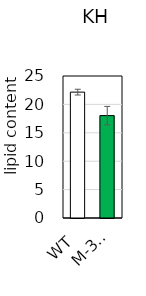
| Category | KH |
|---|---|
| 0 | 22.161 |
| 1 | 18.027 |